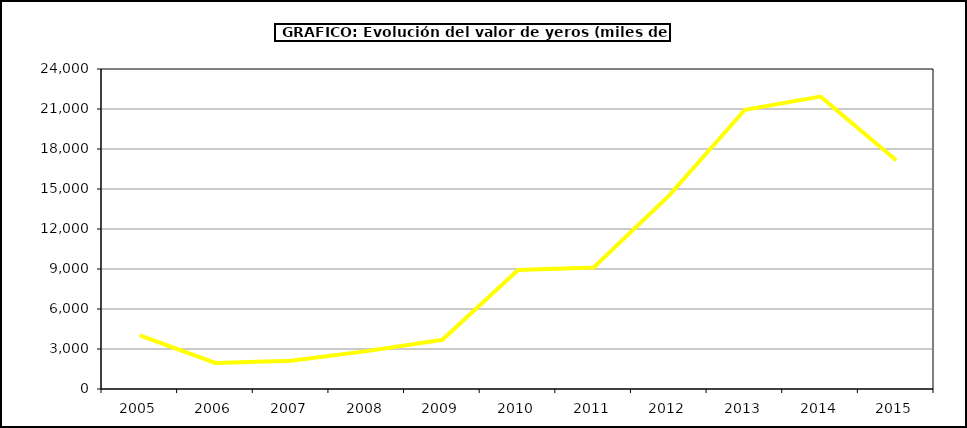
| Category | Valor |
|---|---|
| 2005.0 | 4018.977 |
| 2006.0 | 1953.466 |
| 2007.0 | 2125.671 |
| 2008.0 | 2839.518 |
| 2009.0 | 3689.373 |
| 2010.0 | 8923.742 |
| 2011.0 | 9108.203 |
| 2012.0 | 14519.486 |
| 2013.0 | 20944.865 |
| 2014.0 | 21928.601 |
| 2015.0 | 17159 |